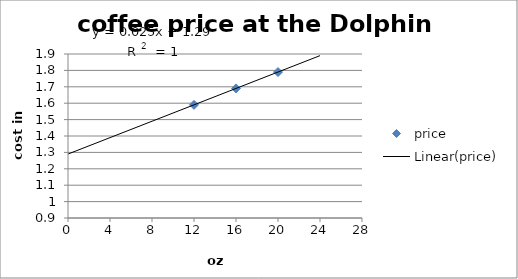
| Category | price |
|---|---|
| 12.0 | 1.59 |
| 16.0 | 1.69 |
| 20.0 | 1.79 |